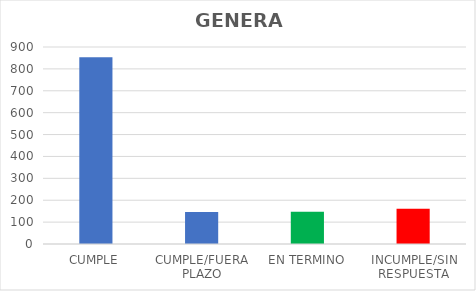
| Category | TOTAL |
|---|---|
| CUMPLE | 853 |
| CUMPLE/FUERA PLAZO | 146 |
| EN TERMINO | 147 |
| INCUMPLE/SIN RESPUESTA | 161 |